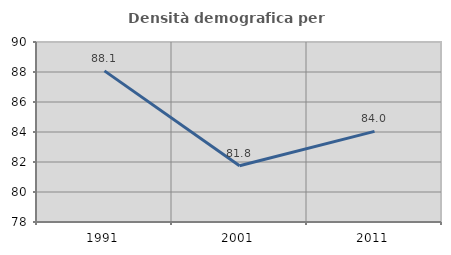
| Category | Densità demografica |
|---|---|
| 1991.0 | 88.075 |
| 2001.0 | 81.754 |
| 2011.0 | 84.042 |